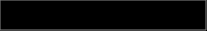
| Category | Series 0 |
|---|---|
| 0 | 0.122 |
| 1 | 0.723 |
| 2 | 0.155 |